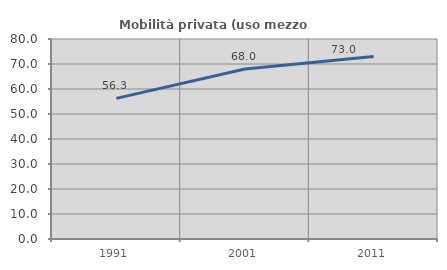
| Category | Mobilità privata (uso mezzo privato) |
|---|---|
| 1991.0 | 56.256 |
| 2001.0 | 67.991 |
| 2011.0 | 72.991 |